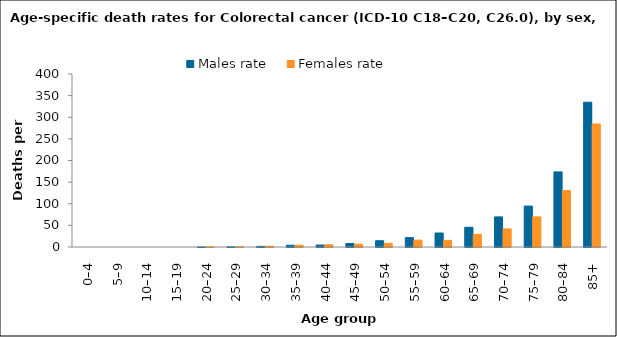
| Category | Males rate | Females rate |
|---|---|---|
| 0–4 | 0 | 0 |
| 5–9 | 0 | 0 |
| 10–14 | 0 | 0 |
| 15–19 | 0 | 0 |
| 20–24 | 0.119 | 0.254 |
| 25–29 | 0.327 | 0.221 |
| 30–34 | 1.489 | 1.564 |
| 35–39 | 4.094 | 4.153 |
| 40–44 | 4.535 | 5.247 |
| 45–49 | 8.075 | 6.485 |
| 50–54 | 14.481 | 8.441 |
| 55–59 | 21.769 | 15.864 |
| 60–64 | 32.34 | 15.388 |
| 65–69 | 45.665 | 29.429 |
| 70–74 | 69.588 | 41.886 |
| 75–79 | 94.626 | 69.631 |
| 80–84 | 173.626 | 130.311 |
| 85+ | 334.743 | 284.535 |